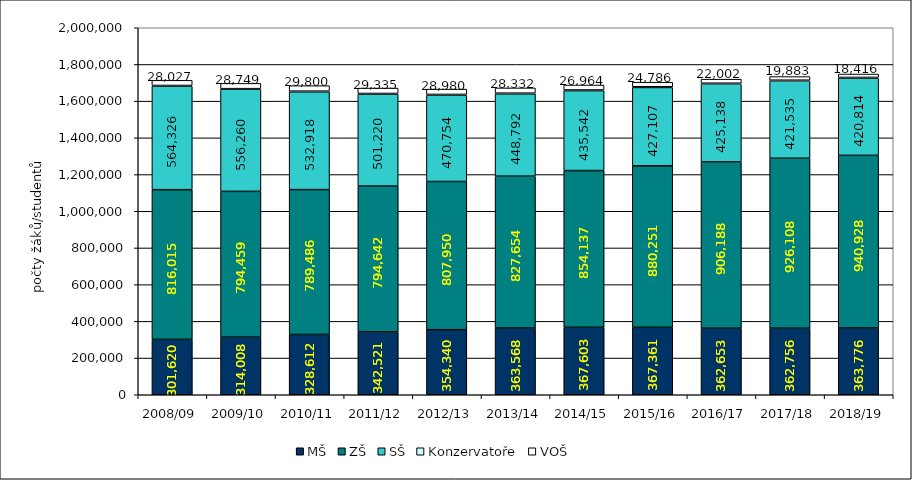
| Category | MŠ | ZŠ | SŠ | Konzervatoře | VOŠ |
|---|---|---|---|---|---|
| 2008/09 | 301620 | 816015 | 564326 | 3535 | 28027 |
| 2009/10 | 314008 | 794459 | 556260 | 3435 | 28749 |
| 2010/11 | 328612 | 789486 | 532918 | 3560 | 29800 |
| 2011/12 | 342521 | 794642 | 501220 | 3557 | 29335 |
| 2012/13 | 354340 | 807950 | 470754 | 3655 | 28980 |
| 2013/14 | 363568 | 827654 | 448792 | 3690 | 28332 |
| 2014/15 | 367603 | 854137 | 435542 | 3752 | 26964 |
| 2015/16 | 367361 | 880251 | 427107 | 3733 | 24786 |
| 2016/17 | 362653 | 906188 | 425138 | 3795 | 22002 |
| 2017/18 | 362756 | 926108 | 421535 | 3781 | 19883 |
| 2018/19 | 363776 | 940928 | 420814 | 3813 | 18416 |